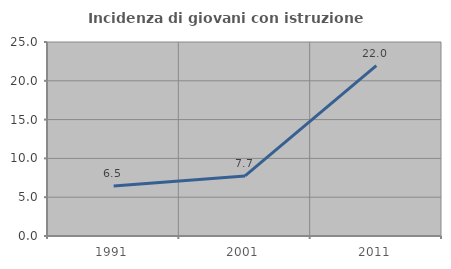
| Category | Incidenza di giovani con istruzione universitaria |
|---|---|
| 1991.0 | 6.452 |
| 2001.0 | 7.738 |
| 2011.0 | 21.951 |